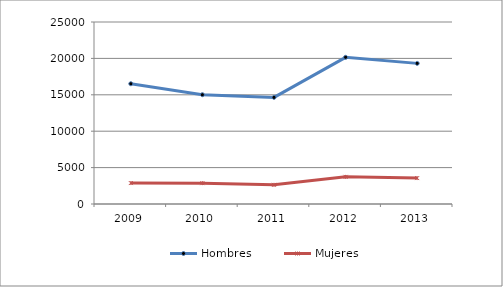
| Category | Hombres | Mujeres |
|---|---|---|
| 2009.0 | 16522 | 2877 |
| 2010.0 | 15012 | 2866 |
| 2011.0 | 14644 | 2632 |
| 2012.0 | 20148 | 3726 |
| 2013.0 | 19316 | 3562 |